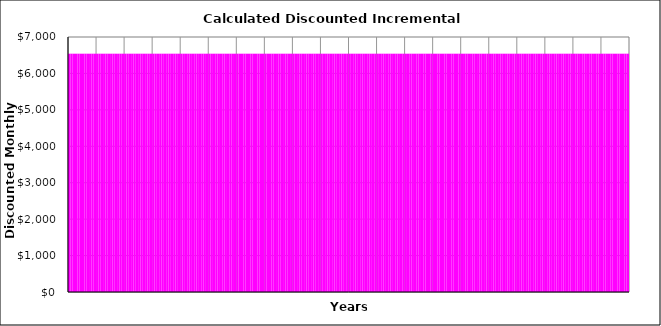
| Category | Stage (1) | Stage (2) | Stage (3) | Stage (4) | Stage (5) | Stage (6) | Stage (7) | Stage (8) | Stage (9) | Stage (10) |
|---|---|---|---|---|---|---|---|---|---|---|
| 0 | 6541.667 | 0 | 0 | 0 | 0 | 0 | 0 | 0 | 0 | 0 |
| 1 | 6541.667 | 0 | 0 | 0 | 0 | 0 | 0 | 0 | 0 | 0 |
| 2 | 6541.667 | 0 | 0 | 0 | 0 | 0 | 0 | 0 | 0 | 0 |
| 3 | 6541.667 | 0 | 0 | 0 | 0 | 0 | 0 | 0 | 0 | 0 |
| 4 | 6541.667 | 0 | 0 | 0 | 0 | 0 | 0 | 0 | 0 | 0 |
| 5 | 6541.667 | 0 | 0 | 0 | 0 | 0 | 0 | 0 | 0 | 0 |
| 6 | 6541.667 | 0 | 0 | 0 | 0 | 0 | 0 | 0 | 0 | 0 |
| 7 | 6541.667 | 0 | 0 | 0 | 0 | 0 | 0 | 0 | 0 | 0 |
| 8 | 6541.667 | 0 | 0 | 0 | 0 | 0 | 0 | 0 | 0 | 0 |
| 9 | 6541.667 | 0 | 0 | 0 | 0 | 0 | 0 | 0 | 0 | 0 |
| 10 | 6541.667 | 0 | 0 | 0 | 0 | 0 | 0 | 0 | 0 | 0 |
| 11 | 6541.667 | 0 | 0 | 0 | 0 | 0 | 0 | 0 | 0 | 0 |
| 12 | 6541.667 | 0 | 0 | 0 | 0 | 0 | 0 | 0 | 0 | 0 |
| 13 | 6541.667 | 0 | 0 | 0 | 0 | 0 | 0 | 0 | 0 | 0 |
| 14 | 6541.667 | 0 | 0 | 0 | 0 | 0 | 0 | 0 | 0 | 0 |
| 15 | 6541.667 | 0 | 0 | 0 | 0 | 0 | 0 | 0 | 0 | 0 |
| 16 | 6541.667 | 0 | 0 | 0 | 0 | 0 | 0 | 0 | 0 | 0 |
| 17 | 6541.667 | 0 | 0 | 0 | 0 | 0 | 0 | 0 | 0 | 0 |
| 18 | 6541.667 | 0 | 0 | 0 | 0 | 0 | 0 | 0 | 0 | 0 |
| 19 | 6541.667 | 0 | 0 | 0 | 0 | 0 | 0 | 0 | 0 | 0 |
| 20 | 6541.667 | 0 | 0 | 0 | 0 | 0 | 0 | 0 | 0 | 0 |
| 21 | 6541.667 | 0 | 0 | 0 | 0 | 0 | 0 | 0 | 0 | 0 |
| 22 | 6541.667 | 0 | 0 | 0 | 0 | 0 | 0 | 0 | 0 | 0 |
| 23 | 6541.667 | 0 | 0 | 0 | 0 | 0 | 0 | 0 | 0 | 0 |
| 24 | 6541.667 | 0 | 0 | 0 | 0 | 0 | 0 | 0 | 0 | 0 |
| 25 | 6541.667 | 0 | 0 | 0 | 0 | 0 | 0 | 0 | 0 | 0 |
| 26 | 6541.667 | 0 | 0 | 0 | 0 | 0 | 0 | 0 | 0 | 0 |
| 27 | 6541.667 | 0 | 0 | 0 | 0 | 0 | 0 | 0 | 0 | 0 |
| 28 | 6541.667 | 0 | 0 | 0 | 0 | 0 | 0 | 0 | 0 | 0 |
| 29 | 6541.667 | 0 | 0 | 0 | 0 | 0 | 0 | 0 | 0 | 0 |
| 30 | 6541.667 | 0 | 0 | 0 | 0 | 0 | 0 | 0 | 0 | 0 |
| 31 | 6541.667 | 0 | 0 | 0 | 0 | 0 | 0 | 0 | 0 | 0 |
| 32 | 6541.667 | 0 | 0 | 0 | 0 | 0 | 0 | 0 | 0 | 0 |
| 33 | 6541.667 | 0 | 0 | 0 | 0 | 0 | 0 | 0 | 0 | 0 |
| 34 | 6541.667 | 0 | 0 | 0 | 0 | 0 | 0 | 0 | 0 | 0 |
| 35 | 6541.667 | 0 | 0 | 0 | 0 | 0 | 0 | 0 | 0 | 0 |
| 36 | 6541.667 | 0 | 0 | 0 | 0 | 0 | 0 | 0 | 0 | 0 |
| 37 | 6541.667 | 0 | 0 | 0 | 0 | 0 | 0 | 0 | 0 | 0 |
| 38 | 6541.667 | 0 | 0 | 0 | 0 | 0 | 0 | 0 | 0 | 0 |
| 39 | 6541.667 | 0 | 0 | 0 | 0 | 0 | 0 | 0 | 0 | 0 |
| 40 | 6541.667 | 0 | 0 | 0 | 0 | 0 | 0 | 0 | 0 | 0 |
| 41 | 6541.667 | 0 | 0 | 0 | 0 | 0 | 0 | 0 | 0 | 0 |
| 42 | 6541.667 | 0 | 0 | 0 | 0 | 0 | 0 | 0 | 0 | 0 |
| 43 | 6541.667 | 0 | 0 | 0 | 0 | 0 | 0 | 0 | 0 | 0 |
| 44 | 6541.667 | 0 | 0 | 0 | 0 | 0 | 0 | 0 | 0 | 0 |
| 45 | 6541.667 | 0 | 0 | 0 | 0 | 0 | 0 | 0 | 0 | 0 |
| 46 | 6541.667 | 0 | 0 | 0 | 0 | 0 | 0 | 0 | 0 | 0 |
| 47 | 6541.667 | 0 | 0 | 0 | 0 | 0 | 0 | 0 | 0 | 0 |
| 48 | 6541.667 | 0 | 0 | 0 | 0 | 0 | 0 | 0 | 0 | 0 |
| 49 | 6541.667 | 0 | 0 | 0 | 0 | 0 | 0 | 0 | 0 | 0 |
| 50 | 6541.667 | 0 | 0 | 0 | 0 | 0 | 0 | 0 | 0 | 0 |
| 51 | 6541.667 | 0 | 0 | 0 | 0 | 0 | 0 | 0 | 0 | 0 |
| 52 | 6541.667 | 0 | 0 | 0 | 0 | 0 | 0 | 0 | 0 | 0 |
| 53 | 6541.667 | 0 | 0 | 0 | 0 | 0 | 0 | 0 | 0 | 0 |
| 54 | 6541.667 | 0 | 0 | 0 | 0 | 0 | 0 | 0 | 0 | 0 |
| 55 | 6541.667 | 0 | 0 | 0 | 0 | 0 | 0 | 0 | 0 | 0 |
| 56 | 6541.667 | 0 | 0 | 0 | 0 | 0 | 0 | 0 | 0 | 0 |
| 57 | 6541.667 | 0 | 0 | 0 | 0 | 0 | 0 | 0 | 0 | 0 |
| 58 | 6541.667 | 0 | 0 | 0 | 0 | 0 | 0 | 0 | 0 | 0 |
| 59 | 6541.667 | 0 | 0 | 0 | 0 | 0 | 0 | 0 | 0 | 0 |
| 60 | 6541.667 | 0 | 0 | 0 | 0 | 0 | 0 | 0 | 0 | 0 |
| 61 | 6541.667 | 0 | 0 | 0 | 0 | 0 | 0 | 0 | 0 | 0 |
| 62 | 6541.667 | 0 | 0 | 0 | 0 | 0 | 0 | 0 | 0 | 0 |
| 63 | 6541.667 | 0 | 0 | 0 | 0 | 0 | 0 | 0 | 0 | 0 |
| 64 | 6541.667 | 0 | 0 | 0 | 0 | 0 | 0 | 0 | 0 | 0 |
| 65 | 6541.667 | 0 | 0 | 0 | 0 | 0 | 0 | 0 | 0 | 0 |
| 66 | 6541.667 | 0 | 0 | 0 | 0 | 0 | 0 | 0 | 0 | 0 |
| 67 | 6541.667 | 0 | 0 | 0 | 0 | 0 | 0 | 0 | 0 | 0 |
| 68 | 6541.667 | 0 | 0 | 0 | 0 | 0 | 0 | 0 | 0 | 0 |
| 69 | 6541.667 | 0 | 0 | 0 | 0 | 0 | 0 | 0 | 0 | 0 |
| 70 | 6541.667 | 0 | 0 | 0 | 0 | 0 | 0 | 0 | 0 | 0 |
| 71 | 6541.667 | 0 | 0 | 0 | 0 | 0 | 0 | 0 | 0 | 0 |
| 72 | 6541.667 | 0 | 0 | 0 | 0 | 0 | 0 | 0 | 0 | 0 |
| 73 | 6541.667 | 0 | 0 | 0 | 0 | 0 | 0 | 0 | 0 | 0 |
| 74 | 6541.667 | 0 | 0 | 0 | 0 | 0 | 0 | 0 | 0 | 0 |
| 75 | 6541.667 | 0 | 0 | 0 | 0 | 0 | 0 | 0 | 0 | 0 |
| 76 | 6541.667 | 0 | 0 | 0 | 0 | 0 | 0 | 0 | 0 | 0 |
| 77 | 6541.667 | 0 | 0 | 0 | 0 | 0 | 0 | 0 | 0 | 0 |
| 78 | 6541.667 | 0 | 0 | 0 | 0 | 0 | 0 | 0 | 0 | 0 |
| 79 | 6541.667 | 0 | 0 | 0 | 0 | 0 | 0 | 0 | 0 | 0 |
| 80 | 6541.667 | 0 | 0 | 0 | 0 | 0 | 0 | 0 | 0 | 0 |
| 81 | 6541.667 | 0 | 0 | 0 | 0 | 0 | 0 | 0 | 0 | 0 |
| 82 | 6541.667 | 0 | 0 | 0 | 0 | 0 | 0 | 0 | 0 | 0 |
| 83 | 6541.667 | 0 | 0 | 0 | 0 | 0 | 0 | 0 | 0 | 0 |
| 84 | 6541.667 | 0 | 0 | 0 | 0 | 0 | 0 | 0 | 0 | 0 |
| 85 | 6541.667 | 0 | 0 | 0 | 0 | 0 | 0 | 0 | 0 | 0 |
| 86 | 6541.667 | 0 | 0 | 0 | 0 | 0 | 0 | 0 | 0 | 0 |
| 87 | 6541.667 | 0 | 0 | 0 | 0 | 0 | 0 | 0 | 0 | 0 |
| 88 | 6541.667 | 0 | 0 | 0 | 0 | 0 | 0 | 0 | 0 | 0 |
| 89 | 6541.667 | 0 | 0 | 0 | 0 | 0 | 0 | 0 | 0 | 0 |
| 90 | 6541.667 | 0 | 0 | 0 | 0 | 0 | 0 | 0 | 0 | 0 |
| 91 | 6541.667 | 0 | 0 | 0 | 0 | 0 | 0 | 0 | 0 | 0 |
| 92 | 6541.667 | 0 | 0 | 0 | 0 | 0 | 0 | 0 | 0 | 0 |
| 93 | 6541.667 | 0 | 0 | 0 | 0 | 0 | 0 | 0 | 0 | 0 |
| 94 | 6541.667 | 0 | 0 | 0 | 0 | 0 | 0 | 0 | 0 | 0 |
| 95 | 6541.667 | 0 | 0 | 0 | 0 | 0 | 0 | 0 | 0 | 0 |
| 96 | 6541.667 | 0 | 0 | 0 | 0 | 0 | 0 | 0 | 0 | 0 |
| 97 | 6541.667 | 0 | 0 | 0 | 0 | 0 | 0 | 0 | 0 | 0 |
| 98 | 6541.667 | 0 | 0 | 0 | 0 | 0 | 0 | 0 | 0 | 0 |
| 99 | 6541.667 | 0 | 0 | 0 | 0 | 0 | 0 | 0 | 0 | 0 |
| 100 | 6541.667 | 0 | 0 | 0 | 0 | 0 | 0 | 0 | 0 | 0 |
| 101 | 6541.667 | 0 | 0 | 0 | 0 | 0 | 0 | 0 | 0 | 0 |
| 102 | 6541.667 | 0 | 0 | 0 | 0 | 0 | 0 | 0 | 0 | 0 |
| 103 | 6541.667 | 0 | 0 | 0 | 0 | 0 | 0 | 0 | 0 | 0 |
| 104 | 6541.667 | 0 | 0 | 0 | 0 | 0 | 0 | 0 | 0 | 0 |
| 105 | 6541.667 | 0 | 0 | 0 | 0 | 0 | 0 | 0 | 0 | 0 |
| 106 | 6541.667 | 0 | 0 | 0 | 0 | 0 | 0 | 0 | 0 | 0 |
| 107 | 6541.667 | 0 | 0 | 0 | 0 | 0 | 0 | 0 | 0 | 0 |
| 108 | 6541.667 | 0 | 0 | 0 | 0 | 0 | 0 | 0 | 0 | 0 |
| 109 | 6541.667 | 0 | 0 | 0 | 0 | 0 | 0 | 0 | 0 | 0 |
| 110 | 6541.667 | 0 | 0 | 0 | 0 | 0 | 0 | 0 | 0 | 0 |
| 111 | 6541.667 | 0 | 0 | 0 | 0 | 0 | 0 | 0 | 0 | 0 |
| 112 | 6541.667 | 0 | 0 | 0 | 0 | 0 | 0 | 0 | 0 | 0 |
| 113 | 6541.667 | 0 | 0 | 0 | 0 | 0 | 0 | 0 | 0 | 0 |
| 114 | 6541.667 | 0 | 0 | 0 | 0 | 0 | 0 | 0 | 0 | 0 |
| 115 | 6541.667 | 0 | 0 | 0 | 0 | 0 | 0 | 0 | 0 | 0 |
| 116 | 6541.667 | 0 | 0 | 0 | 0 | 0 | 0 | 0 | 0 | 0 |
| 117 | 6541.667 | 0 | 0 | 0 | 0 | 0 | 0 | 0 | 0 | 0 |
| 118 | 6541.667 | 0 | 0 | 0 | 0 | 0 | 0 | 0 | 0 | 0 |
| 119 | 6541.667 | 0 | 0 | 0 | 0 | 0 | 0 | 0 | 0 | 0 |
| 120 | 6541.667 | 0 | 0 | 0 | 0 | 0 | 0 | 0 | 0 | 0 |
| 121 | 6541.667 | 0 | 0 | 0 | 0 | 0 | 0 | 0 | 0 | 0 |
| 122 | 6541.667 | 0 | 0 | 0 | 0 | 0 | 0 | 0 | 0 | 0 |
| 123 | 6541.667 | 0 | 0 | 0 | 0 | 0 | 0 | 0 | 0 | 0 |
| 124 | 6541.667 | 0 | 0 | 0 | 0 | 0 | 0 | 0 | 0 | 0 |
| 125 | 6541.667 | 0 | 0 | 0 | 0 | 0 | 0 | 0 | 0 | 0 |
| 126 | 6541.667 | 0 | 0 | 0 | 0 | 0 | 0 | 0 | 0 | 0 |
| 127 | 6541.667 | 0 | 0 | 0 | 0 | 0 | 0 | 0 | 0 | 0 |
| 128 | 6541.667 | 0 | 0 | 0 | 0 | 0 | 0 | 0 | 0 | 0 |
| 129 | 6541.667 | 0 | 0 | 0 | 0 | 0 | 0 | 0 | 0 | 0 |
| 130 | 6541.667 | 0 | 0 | 0 | 0 | 0 | 0 | 0 | 0 | 0 |
| 131 | 6541.667 | 0 | 0 | 0 | 0 | 0 | 0 | 0 | 0 | 0 |
| 132 | 6541.667 | 0 | 0 | 0 | 0 | 0 | 0 | 0 | 0 | 0 |
| 133 | 6541.667 | 0 | 0 | 0 | 0 | 0 | 0 | 0 | 0 | 0 |
| 134 | 6541.667 | 0 | 0 | 0 | 0 | 0 | 0 | 0 | 0 | 0 |
| 135 | 6541.667 | 0 | 0 | 0 | 0 | 0 | 0 | 0 | 0 | 0 |
| 136 | 6541.667 | 0 | 0 | 0 | 0 | 0 | 0 | 0 | 0 | 0 |
| 137 | 6541.667 | 0 | 0 | 0 | 0 | 0 | 0 | 0 | 0 | 0 |
| 138 | 6541.667 | 0 | 0 | 0 | 0 | 0 | 0 | 0 | 0 | 0 |
| 139 | 6541.667 | 0 | 0 | 0 | 0 | 0 | 0 | 0 | 0 | 0 |
| 140 | 6541.667 | 0 | 0 | 0 | 0 | 0 | 0 | 0 | 0 | 0 |
| 141 | 6541.667 | 0 | 0 | 0 | 0 | 0 | 0 | 0 | 0 | 0 |
| 142 | 6541.667 | 0 | 0 | 0 | 0 | 0 | 0 | 0 | 0 | 0 |
| 143 | 6541.667 | 0 | 0 | 0 | 0 | 0 | 0 | 0 | 0 | 0 |
| 144 | 6541.667 | 0 | 0 | 0 | 0 | 0 | 0 | 0 | 0 | 0 |
| 145 | 6541.667 | 0 | 0 | 0 | 0 | 0 | 0 | 0 | 0 | 0 |
| 146 | 6541.667 | 0 | 0 | 0 | 0 | 0 | 0 | 0 | 0 | 0 |
| 147 | 6541.667 | 0 | 0 | 0 | 0 | 0 | 0 | 0 | 0 | 0 |
| 148 | 6541.667 | 0 | 0 | 0 | 0 | 0 | 0 | 0 | 0 | 0 |
| 149 | 6541.667 | 0 | 0 | 0 | 0 | 0 | 0 | 0 | 0 | 0 |
| 150 | 6541.667 | 0 | 0 | 0 | 0 | 0 | 0 | 0 | 0 | 0 |
| 151 | 6541.667 | 0 | 0 | 0 | 0 | 0 | 0 | 0 | 0 | 0 |
| 152 | 6541.667 | 0 | 0 | 0 | 0 | 0 | 0 | 0 | 0 | 0 |
| 153 | 6541.667 | 0 | 0 | 0 | 0 | 0 | 0 | 0 | 0 | 0 |
| 154 | 6541.667 | 0 | 0 | 0 | 0 | 0 | 0 | 0 | 0 | 0 |
| 155 | 6541.667 | 0 | 0 | 0 | 0 | 0 | 0 | 0 | 0 | 0 |
| 156 | 6541.667 | 0 | 0 | 0 | 0 | 0 | 0 | 0 | 0 | 0 |
| 157 | 6541.667 | 0 | 0 | 0 | 0 | 0 | 0 | 0 | 0 | 0 |
| 158 | 6541.667 | 0 | 0 | 0 | 0 | 0 | 0 | 0 | 0 | 0 |
| 159 | 6541.667 | 0 | 0 | 0 | 0 | 0 | 0 | 0 | 0 | 0 |
| 160 | 6541.667 | 0 | 0 | 0 | 0 | 0 | 0 | 0 | 0 | 0 |
| 161 | 6541.667 | 0 | 0 | 0 | 0 | 0 | 0 | 0 | 0 | 0 |
| 162 | 6541.667 | 0 | 0 | 0 | 0 | 0 | 0 | 0 | 0 | 0 |
| 163 | 6541.667 | 0 | 0 | 0 | 0 | 0 | 0 | 0 | 0 | 0 |
| 164 | 6541.667 | 0 | 0 | 0 | 0 | 0 | 0 | 0 | 0 | 0 |
| 165 | 6541.667 | 0 | 0 | 0 | 0 | 0 | 0 | 0 | 0 | 0 |
| 166 | 6541.667 | 0 | 0 | 0 | 0 | 0 | 0 | 0 | 0 | 0 |
| 167 | 6541.667 | 0 | 0 | 0 | 0 | 0 | 0 | 0 | 0 | 0 |
| 168 | 6541.667 | 0 | 0 | 0 | 0 | 0 | 0 | 0 | 0 | 0 |
| 169 | 6541.667 | 0 | 0 | 0 | 0 | 0 | 0 | 0 | 0 | 0 |
| 170 | 6541.667 | 0 | 0 | 0 | 0 | 0 | 0 | 0 | 0 | 0 |
| 171 | 6541.667 | 0 | 0 | 0 | 0 | 0 | 0 | 0 | 0 | 0 |
| 172 | 6541.667 | 0 | 0 | 0 | 0 | 0 | 0 | 0 | 0 | 0 |
| 173 | 6541.667 | 0 | 0 | 0 | 0 | 0 | 0 | 0 | 0 | 0 |
| 174 | 6541.667 | 0 | 0 | 0 | 0 | 0 | 0 | 0 | 0 | 0 |
| 175 | 6541.667 | 0 | 0 | 0 | 0 | 0 | 0 | 0 | 0 | 0 |
| 176 | 6541.667 | 0 | 0 | 0 | 0 | 0 | 0 | 0 | 0 | 0 |
| 177 | 6541.667 | 0 | 0 | 0 | 0 | 0 | 0 | 0 | 0 | 0 |
| 178 | 6541.667 | 0 | 0 | 0 | 0 | 0 | 0 | 0 | 0 | 0 |
| 179 | 6541.667 | 0 | 0 | 0 | 0 | 0 | 0 | 0 | 0 | 0 |
| 180 | 6541.667 | 0 | 0 | 0 | 0 | 0 | 0 | 0 | 0 | 0 |
| 181 | 6541.667 | 0 | 0 | 0 | 0 | 0 | 0 | 0 | 0 | 0 |
| 182 | 6541.667 | 0 | 0 | 0 | 0 | 0 | 0 | 0 | 0 | 0 |
| 183 | 6541.667 | 0 | 0 | 0 | 0 | 0 | 0 | 0 | 0 | 0 |
| 184 | 6541.667 | 0 | 0 | 0 | 0 | 0 | 0 | 0 | 0 | 0 |
| 185 | 6541.667 | 0 | 0 | 0 | 0 | 0 | 0 | 0 | 0 | 0 |
| 186 | 6541.667 | 0 | 0 | 0 | 0 | 0 | 0 | 0 | 0 | 0 |
| 187 | 6541.667 | 0 | 0 | 0 | 0 | 0 | 0 | 0 | 0 | 0 |
| 188 | 6541.667 | 0 | 0 | 0 | 0 | 0 | 0 | 0 | 0 | 0 |
| 189 | 6541.667 | 0 | 0 | 0 | 0 | 0 | 0 | 0 | 0 | 0 |
| 190 | 6541.667 | 0 | 0 | 0 | 0 | 0 | 0 | 0 | 0 | 0 |
| 191 | 6541.667 | 0 | 0 | 0 | 0 | 0 | 0 | 0 | 0 | 0 |
| 192 | 6541.667 | 0 | 0 | 0 | 0 | 0 | 0 | 0 | 0 | 0 |
| 193 | 6541.667 | 0 | 0 | 0 | 0 | 0 | 0 | 0 | 0 | 0 |
| 194 | 6541.667 | 0 | 0 | 0 | 0 | 0 | 0 | 0 | 0 | 0 |
| 195 | 6541.667 | 0 | 0 | 0 | 0 | 0 | 0 | 0 | 0 | 0 |
| 196 | 6541.667 | 0 | 0 | 0 | 0 | 0 | 0 | 0 | 0 | 0 |
| 197 | 6541.667 | 0 | 0 | 0 | 0 | 0 | 0 | 0 | 0 | 0 |
| 198 | 6541.667 | 0 | 0 | 0 | 0 | 0 | 0 | 0 | 0 | 0 |
| 199 | 6541.667 | 0 | 0 | 0 | 0 | 0 | 0 | 0 | 0 | 0 |
| 200 | 6541.667 | 0 | 0 | 0 | 0 | 0 | 0 | 0 | 0 | 0 |
| 201 | 6541.667 | 0 | 0 | 0 | 0 | 0 | 0 | 0 | 0 | 0 |
| 202 | 6541.667 | 0 | 0 | 0 | 0 | 0 | 0 | 0 | 0 | 0 |
| 203 | 6541.667 | 0 | 0 | 0 | 0 | 0 | 0 | 0 | 0 | 0 |
| 204 | 6541.667 | 0 | 0 | 0 | 0 | 0 | 0 | 0 | 0 | 0 |
| 205 | 6541.667 | 0 | 0 | 0 | 0 | 0 | 0 | 0 | 0 | 0 |
| 206 | 6541.667 | 0 | 0 | 0 | 0 | 0 | 0 | 0 | 0 | 0 |
| 207 | 6541.667 | 0 | 0 | 0 | 0 | 0 | 0 | 0 | 0 | 0 |
| 208 | 6541.667 | 0 | 0 | 0 | 0 | 0 | 0 | 0 | 0 | 0 |
| 209 | 6541.667 | 0 | 0 | 0 | 0 | 0 | 0 | 0 | 0 | 0 |
| 210 | 6541.667 | 0 | 0 | 0 | 0 | 0 | 0 | 0 | 0 | 0 |
| 211 | 6541.667 | 0 | 0 | 0 | 0 | 0 | 0 | 0 | 0 | 0 |
| 212 | 6541.667 | 0 | 0 | 0 | 0 | 0 | 0 | 0 | 0 | 0 |
| 213 | 6541.667 | 0 | 0 | 0 | 0 | 0 | 0 | 0 | 0 | 0 |
| 214 | 6541.667 | 0 | 0 | 0 | 0 | 0 | 0 | 0 | 0 | 0 |
| 215 | 6541.667 | 0 | 0 | 0 | 0 | 0 | 0 | 0 | 0 | 0 |
| 216 | 6541.667 | 0 | 0 | 0 | 0 | 0 | 0 | 0 | 0 | 0 |
| 217 | 6541.667 | 0 | 0 | 0 | 0 | 0 | 0 | 0 | 0 | 0 |
| 218 | 6541.667 | 0 | 0 | 0 | 0 | 0 | 0 | 0 | 0 | 0 |
| 219 | 6541.667 | 0 | 0 | 0 | 0 | 0 | 0 | 0 | 0 | 0 |
| 220 | 6541.667 | 0 | 0 | 0 | 0 | 0 | 0 | 0 | 0 | 0 |
| 221 | 6541.667 | 0 | 0 | 0 | 0 | 0 | 0 | 0 | 0 | 0 |
| 222 | 6541.667 | 0 | 0 | 0 | 0 | 0 | 0 | 0 | 0 | 0 |
| 223 | 6541.667 | 0 | 0 | 0 | 0 | 0 | 0 | 0 | 0 | 0 |
| 224 | 6541.667 | 0 | 0 | 0 | 0 | 0 | 0 | 0 | 0 | 0 |
| 225 | 6541.667 | 0 | 0 | 0 | 0 | 0 | 0 | 0 | 0 | 0 |
| 226 | 6541.667 | 0 | 0 | 0 | 0 | 0 | 0 | 0 | 0 | 0 |
| 227 | 6541.667 | 0 | 0 | 0 | 0 | 0 | 0 | 0 | 0 | 0 |
| 228 | 6541.667 | 0 | 0 | 0 | 0 | 0 | 0 | 0 | 0 | 0 |
| 229 | 6541.667 | 0 | 0 | 0 | 0 | 0 | 0 | 0 | 0 | 0 |
| 230 | 6541.667 | 0 | 0 | 0 | 0 | 0 | 0 | 0 | 0 | 0 |
| 231 | 6541.667 | 0 | 0 | 0 | 0 | 0 | 0 | 0 | 0 | 0 |
| 232 | 6541.667 | 0 | 0 | 0 | 0 | 0 | 0 | 0 | 0 | 0 |
| 233 | 6541.667 | 0 | 0 | 0 | 0 | 0 | 0 | 0 | 0 | 0 |
| 234 | 6541.667 | 0 | 0 | 0 | 0 | 0 | 0 | 0 | 0 | 0 |
| 235 | 6541.667 | 0 | 0 | 0 | 0 | 0 | 0 | 0 | 0 | 0 |
| 236 | 6541.667 | 0 | 0 | 0 | 0 | 0 | 0 | 0 | 0 | 0 |
| 237 | 6541.667 | 0 | 0 | 0 | 0 | 0 | 0 | 0 | 0 | 0 |
| 238 | 6541.667 | 0 | 0 | 0 | 0 | 0 | 0 | 0 | 0 | 0 |
| 239 | 6541.667 | 0 | 0 | 0 | 0 | 0 | 0 | 0 | 0 | 0 |